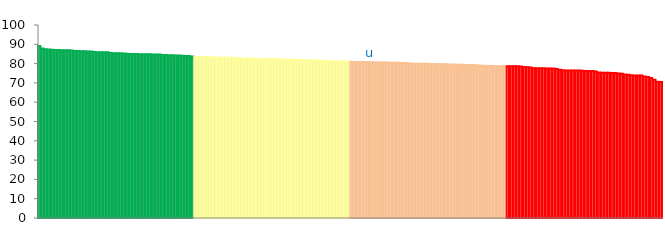
| Category | Top Quartile | 2nd Quartile | 3rd Quartile | Bottom Quartile | Series 4 |
|---|---|---|---|---|---|
|  | 89.096 | 0 | 0 | 0 | 89.096 |
|  | 87.85 | 0 | 0 | 0 | 87.85 |
|  | 87.388 | 0 | 0 | 0 | 87.388 |
|  | 87.271 | 0 | 0 | 0 | 87.271 |
|  | 87.126 | 0 | 0 | 0 | 87.126 |
|  | 87.1 | 0 | 0 | 0 | 87.1 |
|  | 87.086 | 0 | 0 | 0 | 87.086 |
|  | 86.959 | 0 | 0 | 0 | 86.959 |
|  | 86.888 | 0 | 0 | 0 | 86.888 |
|  | 86.859 | 0 | 0 | 0 | 86.859 |
|  | 86.735 | 0 | 0 | 0 | 86.735 |
|  | 86.548 | 0 | 0 | 0 | 86.548 |
|  | 86.481 | 0 | 0 | 0 | 86.481 |
|  | 86.429 | 0 | 0 | 0 | 86.429 |
|  | 86.379 | 0 | 0 | 0 | 86.379 |
|  | 86.266 | 0 | 0 | 0 | 86.266 |
|  | 86.243 | 0 | 0 | 0 | 86.243 |
|  | 86.042 | 0 | 0 | 0 | 86.042 |
|  | 85.936 | 0 | 0 | 0 | 85.936 |
|  | 85.933 | 0 | 0 | 0 | 85.933 |
|  | 85.868 | 0 | 0 | 0 | 85.868 |
|  | 85.843 | 0 | 0 | 0 | 85.843 |
|  | 85.481 | 0 | 0 | 0 | 85.481 |
|  | 85.409 | 0 | 0 | 0 | 85.409 |
|  | 85.366 | 0 | 0 | 0 | 85.366 |
|  | 85.304 | 0 | 0 | 0 | 85.304 |
|  | 85.254 | 0 | 0 | 0 | 85.254 |
|  | 85.145 | 0 | 0 | 0 | 85.145 |
|  | 85.004 | 0 | 0 | 0 | 85.004 |
|  | 84.993 | 0 | 0 | 0 | 84.993 |
|  | 84.94 | 0 | 0 | 0 | 84.94 |
|  | 84.907 | 0 | 0 | 0 | 84.907 |
|  | 84.907 | 0 | 0 | 0 | 84.907 |
|  | 84.838 | 0 | 0 | 0 | 84.838 |
|  | 84.82 | 0 | 0 | 0 | 84.82 |
|  | 84.741 | 0 | 0 | 0 | 84.741 |
|  | 84.717 | 0 | 0 | 0 | 84.717 |
|  | 84.701 | 0 | 0 | 0 | 84.701 |
|  | 84.515 | 0 | 0 | 0 | 84.515 |
|  | 84.424 | 0 | 0 | 0 | 84.424 |
|  | 84.374 | 0 | 0 | 0 | 84.374 |
|  | 84.335 | 0 | 0 | 0 | 84.335 |
|  | 84.248 | 0 | 0 | 0 | 84.248 |
|  | 84.155 | 0 | 0 | 0 | 84.155 |
|  | 84.116 | 0 | 0 | 0 | 84.116 |
|  | 83.979 | 0 | 0 | 0 | 83.979 |
|  | 83.882 | 0 | 0 | 0 | 83.882 |
|  | 83.695 | 0 | 0 | 0 | 83.695 |
|  | 0 | 83.503 | 0 | 0 | 83.503 |
|  | 0 | 83.477 | 0 | 0 | 83.477 |
|  | 0 | 83.467 | 0 | 0 | 83.467 |
|  | 0 | 83.459 | 0 | 0 | 83.459 |
|  | 0 | 83.288 | 0 | 0 | 83.288 |
|  | 0 | 83.252 | 0 | 0 | 83.252 |
|  | 0 | 83.211 | 0 | 0 | 83.211 |
|  | 0 | 83.136 | 0 | 0 | 83.136 |
|  | 0 | 83.084 | 0 | 0 | 83.084 |
|  | 0 | 83.032 | 0 | 0 | 83.032 |
|  | 0 | 83.014 | 0 | 0 | 83.014 |
|  | 0 | 82.982 | 0 | 0 | 82.982 |
|  | 0 | 82.913 | 0 | 0 | 82.913 |
|  | 0 | 82.785 | 0 | 0 | 82.785 |
|  | 0 | 82.701 | 0 | 0 | 82.701 |
|  | 0 | 82.624 | 0 | 0 | 82.624 |
|  | 0 | 82.62 | 0 | 0 | 82.62 |
|  | 0 | 82.551 | 0 | 0 | 82.551 |
|  | 0 | 82.546 | 0 | 0 | 82.546 |
|  | 0 | 82.508 | 0 | 0 | 82.508 |
|  | 0 | 82.403 | 0 | 0 | 82.403 |
|  | 0 | 82.388 | 0 | 0 | 82.388 |
|  | 0 | 82.361 | 0 | 0 | 82.361 |
|  | 0 | 82.335 | 0 | 0 | 82.335 |
|  | 0 | 82.32 | 0 | 0 | 82.32 |
|  | 0 | 82.282 | 0 | 0 | 82.282 |
|  | 0 | 82.247 | 0 | 0 | 82.247 |
|  | 0 | 82.038 | 0 | 0 | 82.038 |
|  | 0 | 82.007 | 0 | 0 | 82.007 |
|  | 0 | 81.982 | 0 | 0 | 81.982 |
|  | 0 | 81.958 | 0 | 0 | 81.958 |
|  | 0 | 81.928 | 0 | 0 | 81.928 |
|  | 0 | 81.876 | 0 | 0 | 81.876 |
|  | 0 | 81.833 | 0 | 0 | 81.833 |
|  | 0 | 81.794 | 0 | 0 | 81.794 |
|  | 0 | 81.746 | 0 | 0 | 81.746 |
|  | 0 | 81.741 | 0 | 0 | 81.741 |
|  | 0 | 81.719 | 0 | 0 | 81.719 |
|  | 0 | 81.456 | 0 | 0 | 81.456 |
|  | 0 | 81.418 | 0 | 0 | 81.418 |
|  | 0 | 81.405 | 0 | 0 | 81.405 |
|  | 0 | 81.293 | 0 | 0 | 81.293 |
|  | 0 | 81.265 | 0 | 0 | 81.265 |
|  | 0 | 81.243 | 0 | 0 | 81.243 |
|  | 0 | 81.222 | 0 | 0 | 81.222 |
|  | 0 | 81.111 | 0 | 0 | 81.111 |
|  | 0 | 81.08 | 0 | 0 | 81.08 |
|  | 0 | 81.022 | 0 | 0 | 81.022 |
|  | 0 | 0 | 80.953 | 0 | 80.953 |
|  | 0 | 0 | 80.818 | 0 | 80.818 |
|  | 0 | 0 | 80.802 | 0 | 80.802 |
|  | 0 | 0 | 80.768 | 0 | 80.768 |
|  | 0 | 0 | 80.768 | 0 | 80.768 |
|  | 0 | 0 | 80.665 | 0 | 80.665 |
| u | 0 | 0 | 80.665 | 0 | 80.665 |